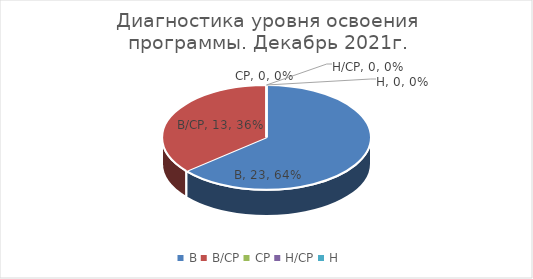
| Category | Золотая рыбка |
|---|---|
| В | 23 |
| В/СР | 13 |
| СР | 0 |
| Н/СР | 0 |
| Н | 0 |